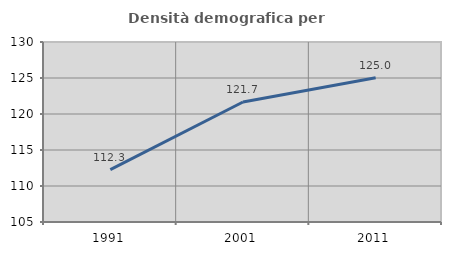
| Category | Densità demografica |
|---|---|
| 1991.0 | 112.265 |
| 2001.0 | 121.668 |
| 2011.0 | 125.042 |